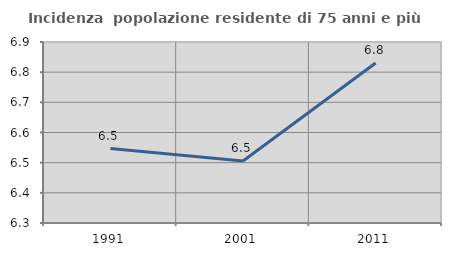
| Category | Incidenza  popolazione residente di 75 anni e più |
|---|---|
| 1991.0 | 6.547 |
| 2001.0 | 6.506 |
| 2011.0 | 6.83 |